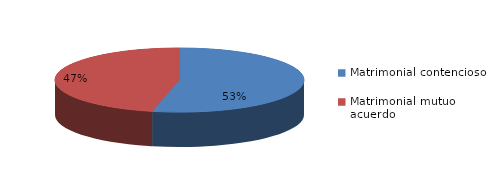
| Category | Series 0 |
|---|---|
| 0 | 284 |
| 1 | 247 |